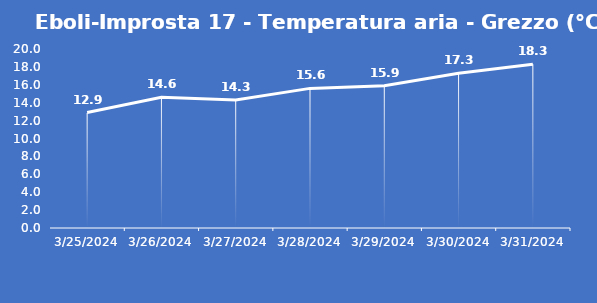
| Category | Eboli-Improsta 17 - Temperatura aria - Grezzo (°C) |
|---|---|
| 3/25/24 | 12.9 |
| 3/26/24 | 14.6 |
| 3/27/24 | 14.3 |
| 3/28/24 | 15.6 |
| 3/29/24 | 15.9 |
| 3/30/24 | 17.3 |
| 3/31/24 | 18.3 |